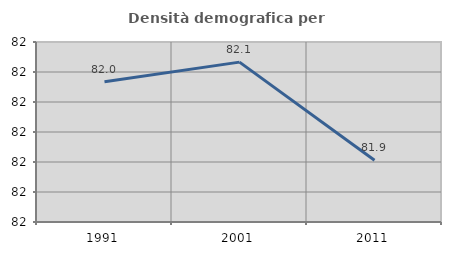
| Category | Densità demografica |
|---|---|
| 1991.0 | 82.034 |
| 2001.0 | 82.066 |
| 2011.0 | 81.903 |